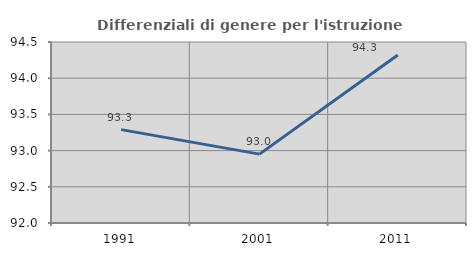
| Category | Differenziali di genere per l'istruzione superiore |
|---|---|
| 1991.0 | 93.29 |
| 2001.0 | 92.951 |
| 2011.0 | 94.32 |